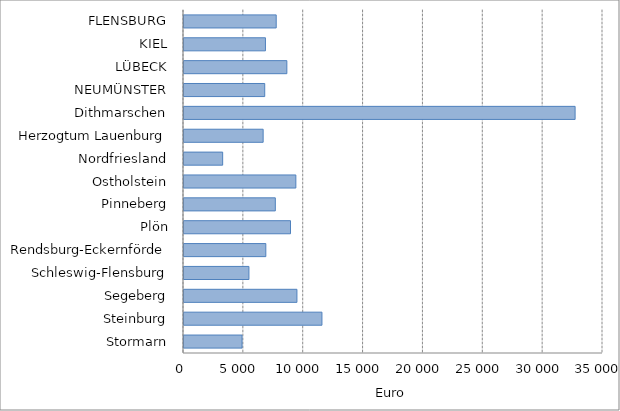
| Category | Euro |
|---|---|
| Stormarn | 4847.865 |
| Steinburg | 11522.576 |
| Segeberg | 9433.559 |
| Schleswig-Flensburg | 5423.381 |
| Rendsburg-Eckernförde | 6834.805 |
| Plön | 8896.891 |
| Pinneberg | 7627.815 |
| Ostholstein | 9343.041 |
| Nordfriesland | 3229.815 |
| Herzogtum Lauenburg | 6610.892 |
| Dithmarschen | 32670 |
| NEUMÜNSTER | 6743.25 |
| LÜBECK | 8591.385 |
| KIEL | 6802.83 |
| FLENSBURG | 7702.042 |